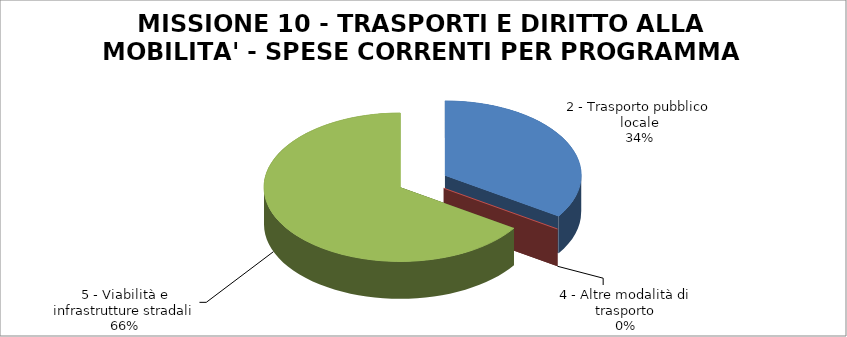
| Category | Series 0 |
|---|---|
| 2 - Trasporto pubblico locale | 854600 |
| 4 - Altre modalità di trasporto | 0 |
| 5 - Viabilità e infrastrutture stradali | 1638867 |